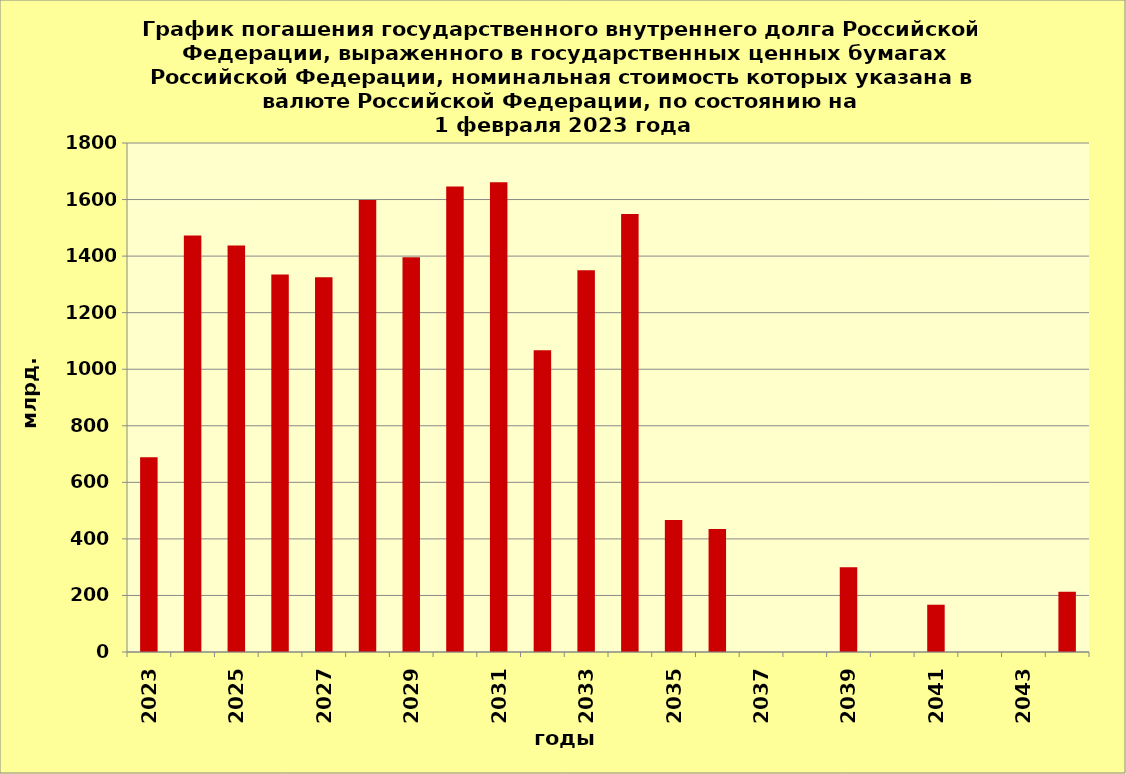
| Category | ряд 1 |
|---|---|
| 2023.0 | 688.761 |
| 2024.0 | 1472.638 |
| 2025.0 | 1437.737 |
| 2026.0 | 1334.561 |
| 2027.0 | 1324.833 |
| 2028.0 | 1598.253 |
| 2029.0 | 1396.103 |
| 2030.0 | 1646.029 |
| 2031.0 | 1661.564 |
| 2032.0 | 1066.973 |
| 2033.0 | 1350 |
| 2034.0 | 1548.84 |
| 2035.0 | 467.105 |
| 2036.0 | 435.039 |
| 2037.0 | 0 |
| 2038.0 | 0 |
| 2039.0 | 300 |
| 2040.0 | 0 |
| 2041.0 | 167.244 |
| 2042.0 | 0 |
| 2043.0 | 0 |
| 2044.0 | 212.636 |